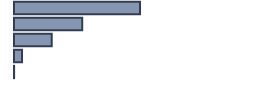
| Category | Percentatge |
|---|---|
| 0 | 52.499 |
| 1 | 28.422 |
| 2 | 15.717 |
| 3 | 3.315 |
| 4 | 0.047 |